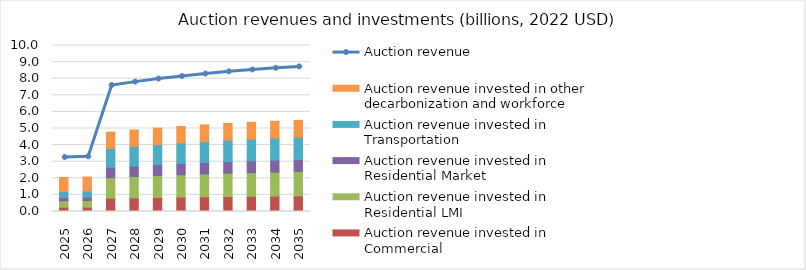
| Category | Auction revenue invested in Commercial | Auction revenue invested in Residential LMI | Auction revenue invested in Residential Market | Auction revenue invested in Transportation | Auction revenue invested in other decarbonization and workforce |
|---|---|---|---|---|---|
| 2025.0 | 0.253 | 0.393 | 0.197 | 0.361 | 0.844 |
| 2026.0 | 0.259 | 0.402 | 0.201 | 0.369 | 0.845 |
| 2027.0 | 0.798 | 1.242 | 0.621 | 1.14 | 0.98 |
| 2028.0 | 0.824 | 1.282 | 0.641 | 1.177 | 0.987 |
| 2029.0 | 0.847 | 1.317 | 0.659 | 1.21 | 0.993 |
| 2030.0 | 0.867 | 1.348 | 0.674 | 1.238 | 0.998 |
| 2031.0 | 0.885 | 1.377 | 0.689 | 1.265 | 1.002 |
| 2032.0 | 0.902 | 1.403 | 0.702 | 1.289 | 1.006 |
| 2033.0 | 0.916 | 1.425 | 0.713 | 1.309 | 1.01 |
| 2034.0 | 0.928 | 1.444 | 0.722 | 1.326 | 1.013 |
| 2035.0 | 0.939 | 1.461 | 0.731 | 1.342 | 1.016 |